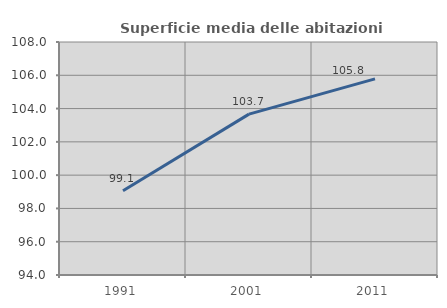
| Category | Superficie media delle abitazioni occupate |
|---|---|
| 1991.0 | 99.058 |
| 2001.0 | 103.666 |
| 2011.0 | 105.784 |